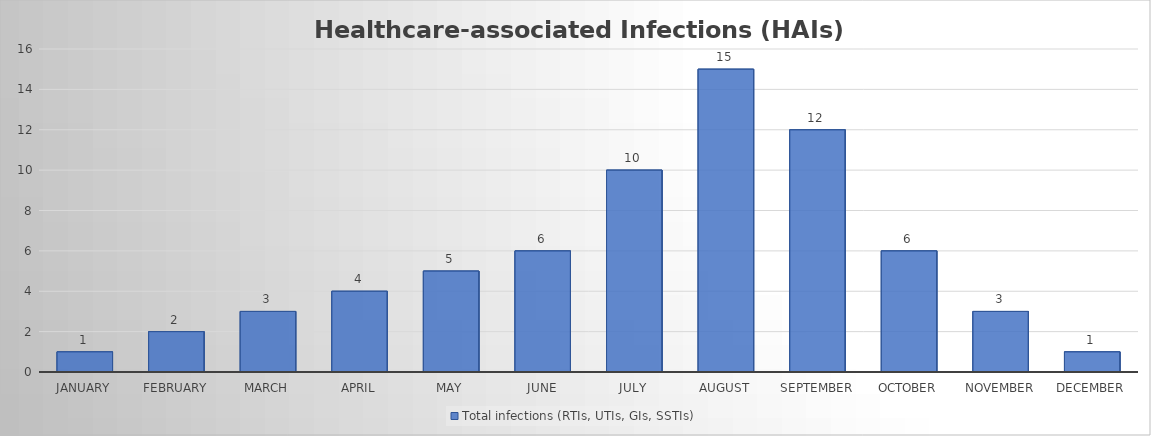
| Category | Total infections (RTIs, UTIs, GIs, SSTIs) |
|---|---|
| January | 1 |
| February | 2 |
| March | 3 |
| April | 4 |
| May | 5 |
| June | 6 |
| July | 10 |
| August | 15 |
| September | 12 |
| October | 6 |
| November | 3 |
| December | 1 |